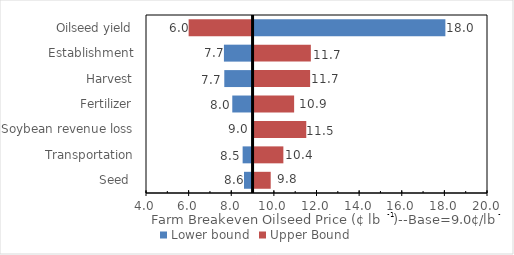
| Category | Lower bound | Upper Bound |
|---|---|---|
| Seed  | 8.598 | 9.805 |
| Transportation | 8.534 | 10.398 |
| Soybean revenue loss | 9 | 11.473 |
| Fertilizer | 8.048 | 10.903 |
| Harvest | 7.673 | 11.654 |
| Establishment | 7.656 | 11.688 |
| Oilseed yield | 18 | 6 |